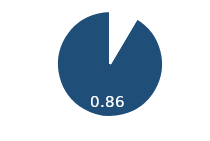
| Category | Pinterest | Facebook |
|---|---|---|
| 0 | 0.08 | 0.12 |
| 1 | 0.86 | 0.89 |